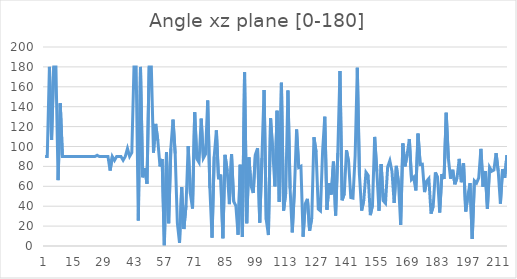
| Category | Angle xz plane [0-180] |
|---|---|
| 0 | 90 |
| 1 | 90 |
| 2 | 180 |
| 3 | 106.485 |
| 4 | 180 |
| 5 | 180 |
| 6 | 66.223 |
| 7 | 143.495 |
| 8 | 90 |
| 9 | 90 |
| 10 | 90 |
| 11 | 90 |
| 12 | 90 |
| 13 | 90 |
| 14 | 90 |
| 15 | 90 |
| 16 | 90 |
| 17 | 90 |
| 18 | 90 |
| 19 | 90 |
| 20 | 90 |
| 21 | 90 |
| 22 | 90 |
| 23 | 90 |
| 24 | 91.156 |
| 25 | 90 |
| 26 | 90 |
| 27 | 90 |
| 28 | 90 |
| 29 | 90 |
| 30 | 75.85 |
| 31 | 90 |
| 32 | 86.07 |
| 33 | 90 |
| 34 | 90 |
| 35 | 90 |
| 36 | 86.27 |
| 37 | 90 |
| 38 | 97.974 |
| 39 | 90 |
| 40 | 93.806 |
| 41 | 180 |
| 42 | 180 |
| 43 | 25.673 |
| 44 | 180 |
| 45 | 69.033 |
| 46 | 78.374 |
| 47 | 62.52 |
| 48 | 180 |
| 49 | 180 |
| 50 | 93.877 |
| 51 | 122.705 |
| 52 | 105.861 |
| 53 | 79.943 |
| 54 | 87.491 |
| 55 | 0.4 |
| 56 | 94.157 |
| 57 | 22.785 |
| 58 | 97.912 |
| 59 | 126.923 |
| 60 | 92.983 |
| 61 | 23.304 |
| 62 | 3.097 |
| 63 | 59.224 |
| 64 | 17.061 |
| 65 | 40.448 |
| 66 | 100.424 |
| 67 | 52.57 |
| 68 | 37.707 |
| 69 | 134.42 |
| 70 | 87.658 |
| 71 | 84.012 |
| 72 | 127.954 |
| 73 | 88.373 |
| 74 | 92.452 |
| 75 | 146.285 |
| 76 | 58.139 |
| 77 | 8.393 |
| 78 | 89.854 |
| 79 | 116.139 |
| 80 | 67.144 |
| 81 | 71.712 |
| 82 | 7.845 |
| 83 | 91.617 |
| 84 | 75.317 |
| 85 | 42.086 |
| 86 | 92.263 |
| 87 | 44.71 |
| 88 | 40.299 |
| 89 | 11.368 |
| 90 | 81.61 |
| 91 | 8.968 |
| 92 | 174.623 |
| 93 | 22.871 |
| 94 | 89.048 |
| 95 | 60.376 |
| 96 | 53.234 |
| 97 | 91.976 |
| 98 | 98.316 |
| 99 | 23.474 |
| 100 | 88.472 |
| 101 | 156.736 |
| 102 | 26.515 |
| 103 | 10.958 |
| 104 | 128.247 |
| 105 | 95.51 |
| 106 | 59.952 |
| 107 | 135.892 |
| 108 | 44.325 |
| 109 | 164.057 |
| 110 | 35.607 |
| 111 | 53.516 |
| 112 | 156.274 |
| 113 | 57.765 |
| 114 | 13.639 |
| 115 | 56.67 |
| 116 | 117.054 |
| 117 | 78.83 |
| 118 | 80.099 |
| 119 | 9.347 |
| 120 | 42.404 |
| 121 | 47.411 |
| 122 | 15.381 |
| 123 | 28.178 |
| 124 | 109.366 |
| 125 | 94.225 |
| 126 | 37.248 |
| 127 | 35.372 |
| 128 | 95.66 |
| 129 | 129.974 |
| 130 | 36.477 |
| 131 | 63.24 |
| 132 | 51.743 |
| 133 | 84.752 |
| 134 | 30.657 |
| 135 | 93.512 |
| 136 | 175.801 |
| 137 | 45.941 |
| 138 | 52.593 |
| 139 | 96.32 |
| 140 | 84.551 |
| 141 | 48.699 |
| 142 | 48.08 |
| 143 | 90.73 |
| 144 | 179.186 |
| 145 | 71.09 |
| 146 | 35.568 |
| 147 | 46.296 |
| 148 | 74.14 |
| 149 | 70.901 |
| 150 | 31.016 |
| 151 | 40.98 |
| 152 | 109.595 |
| 153 | 74.978 |
| 154 | 35.395 |
| 155 | 82.314 |
| 156 | 45.446 |
| 157 | 42.879 |
| 158 | 79.454 |
| 159 | 85.771 |
| 160 | 74.824 |
| 161 | 43.188 |
| 162 | 80.537 |
| 163 | 63.66 |
| 164 | 21.251 |
| 165 | 103.091 |
| 166 | 80.043 |
| 167 | 92.216 |
| 168 | 107.519 |
| 169 | 66.843 |
| 170 | 69.181 |
| 171 | 55.852 |
| 172 | 112.944 |
| 173 | 81.942 |
| 174 | 82.27 |
| 175 | 54.207 |
| 176 | 65.213 |
| 177 | 67.855 |
| 178 | 32.536 |
| 179 | 39.855 |
| 180 | 73.934 |
| 181 | 68.828 |
| 182 | 33.676 |
| 183 | 72.343 |
| 184 | 67.378 |
| 185 | 133.902 |
| 186 | 88.121 |
| 187 | 67.629 |
| 188 | 76.608 |
| 189 | 62.031 |
| 190 | 68.551 |
| 191 | 87.556 |
| 192 | 64.138 |
| 193 | 83.154 |
| 194 | 34.726 |
| 195 | 50.437 |
| 196 | 63.221 |
| 197 | 7.133 |
| 198 | 65.511 |
| 199 | 63.231 |
| 200 | 68.511 |
| 201 | 97.58 |
| 202 | 59.688 |
| 203 | 75.379 |
| 204 | 37.441 |
| 205 | 79.157 |
| 206 | 75.184 |
| 207 | 76.263 |
| 208 | 93.394 |
| 209 | 75.085 |
| 210 | 42.512 |
| 211 | 77.252 |
| 212 | 68.487 |
| 213 | 91.367 |